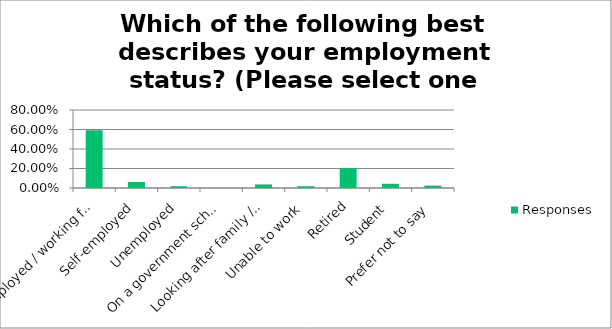
| Category | Responses |
|---|---|
| Employed / working full or part time | 0.593 |
| Self-employed | 0.062 |
| Unemployed | 0.018 |
| On a government scheme for employment training | 0 |
| Looking after family / home | 0.037 |
| Unable to work | 0.018 |
| Retired | 0.204 |
| Student | 0.043 |
| Prefer not to say | 0.025 |